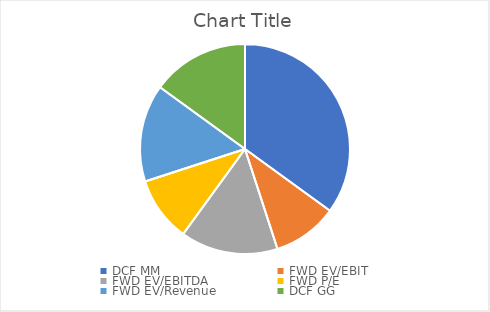
| Category | Series 0 |
|---|---|
| DCF MM | 0.35 |
| FWD EV/EBIT | 0.1 |
| FWD EV/EBITDA | 0.15 |
| FWD P/E | 0.1 |
| FWD EV/Revenue | 0.15 |
| DCF GG | 0.15 |